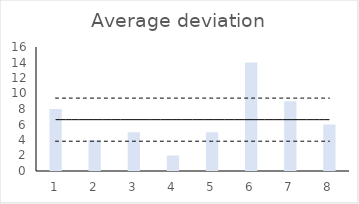
| Category | Series 0 |
|---|---|
| 0 | 8 |
| 1 | 4 |
| 2 | 5 |
| 3 | 2 |
| 4 | 5 |
| 5 | 14 |
| 6 | 9 |
| 7 | 6 |